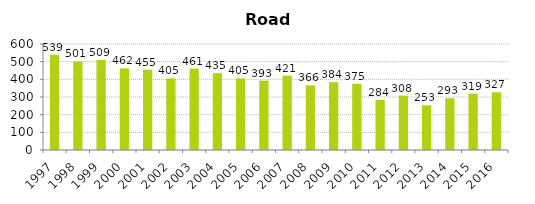
| Category | Series 1 |
|---|---|
| 1997.0 | 539 |
| 1998.0 | 501 |
| 1999.0 | 509 |
| 2000.0 | 462 |
| 2001.0 | 455 |
| 2002.0 | 405 |
| 2003.0 | 461 |
| 2004.0 | 435 |
| 2005.0 | 405 |
| 2006.0 | 393 |
| 2007.0 | 421 |
| 2008.0 | 366 |
| 2009.0 | 384 |
| 2010.0 | 375 |
| 2011.0 | 284 |
| 2012.0 | 308 |
| 2013.0 | 253 |
| 2014.0 | 293 |
| 2015.0 | 319 |
| 2016.0 | 327 |